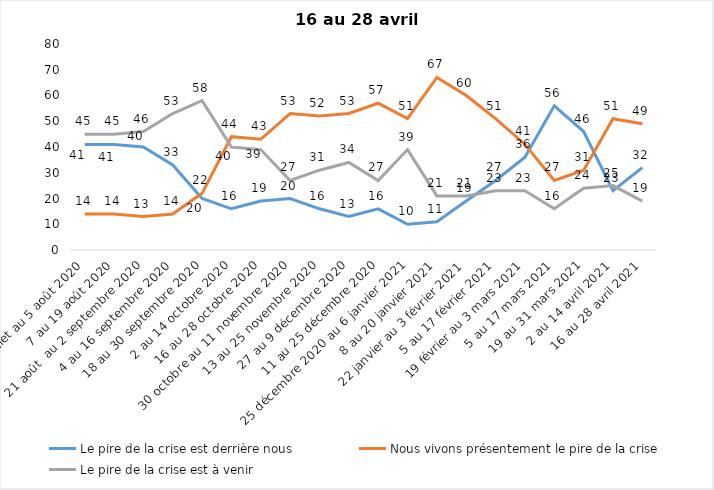
| Category | Le pire de la crise est derrière nous | Nous vivons présentement le pire de la crise | Le pire de la crise est à venir |
|---|---|---|---|
| 24 juillet au 5 août 2020 | 41 | 14 | 45 |
| 7 au 19 août 2020 | 41 | 14 | 45 |
| 21 août  au 2 septembre 2020 | 40 | 13 | 46 |
| 4 au 16 septembre 2020 | 33 | 14 | 53 |
| 18 au 30 septembre 2020 | 20 | 22 | 58 |
| 2 au 14 octobre 2020 | 16 | 44 | 40 |
| 16 au 28 octobre 2020 | 19 | 43 | 39 |
| 30 octobre au 11 novembre 2020 | 20 | 53 | 27 |
| 13 au 25 novembre 2020 | 16 | 52 | 31 |
| 27 au 9 décembre 2020 | 13 | 53 | 34 |
| 11 au 25 décembre 2020 | 16 | 57 | 27 |
| 25 décembre 2020 au 6 janvier 2021 | 10 | 51 | 39 |
| 8 au 20 janvier 2021 | 11 | 67 | 21 |
| 22 janvier au 3 février 2021 | 19 | 60 | 21 |
| 5 au 17 février 2021 | 27 | 51 | 23 |
| 19 février au 3 mars 2021 | 36 | 41 | 23 |
| 5 au 17 mars 2021 | 56 | 27 | 16 |
| 19 au 31 mars 2021 | 46 | 31 | 24 |
| 2 au 14 avril 2021 | 23 | 51 | 25 |
| 16 au 28 avril 2021 | 32 | 49 | 19 |